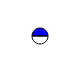
| Category | Series 0 |
|---|---|
| 0 | 2638654 |
| 1 | 2620018 |